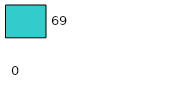
| Category | Series 0 | Series 1 |
|---|---|---|
| 0 | 0 | 69 |